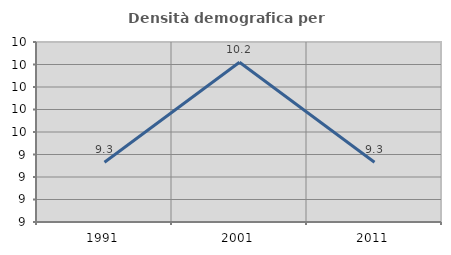
| Category | Densità demografica |
|---|---|
| 1991.0 | 9.332 |
| 2001.0 | 10.22 |
| 2011.0 | 9.332 |